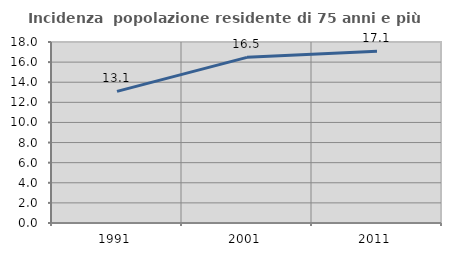
| Category | Incidenza  popolazione residente di 75 anni e più |
|---|---|
| 1991.0 | 13.094 |
| 2001.0 | 16.473 |
| 2011.0 | 17.072 |